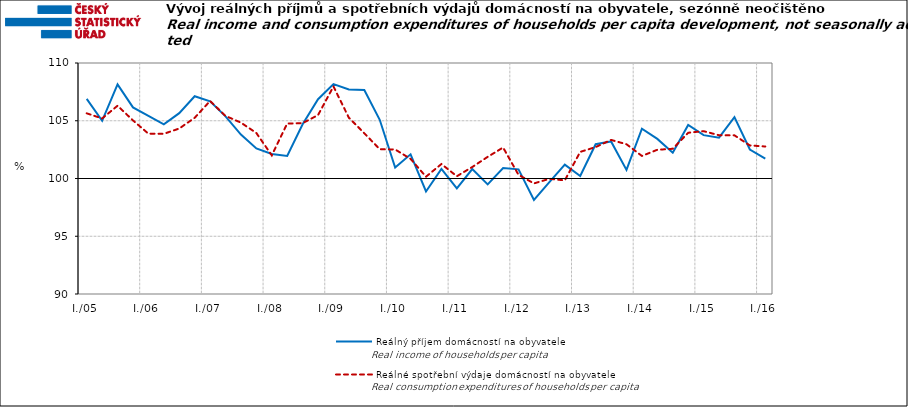
| Category | Reálný příjem domácností na obyvatele | Reálné spotřební výdaje domácností na obyvatele |
|---|---|---|
| I./05 | 106.898 | 105.642 |
|  | 104.998 | 105.199 |
|  | 108.15 | 106.3 |
|  | 106.155 | 105.031 |
| I./06 | 105.431 | 103.879 |
|  | 104.685 | 103.87 |
|  | 105.658 | 104.326 |
|  | 107.121 | 105.256 |
| I./07 | 106.684 | 106.711 |
|  | 105.383 | 105.42 |
|  | 103.807 | 104.837 |
|  | 102.598 | 103.939 |
| I./08 | 102.123 | 102.003 |
|  | 101.955 | 104.757 |
|  | 104.7 | 104.794 |
|  | 106.862 | 105.492 |
| I./09 | 108.173 | 107.97 |
|  | 107.713 | 105.261 |
|  | 107.657 | 103.919 |
|  | 105.084 | 102.535 |
| I./10 | 100.941 | 102.513 |
|  | 102.091 | 101.699 |
|  | 98.879 | 100.155 |
|  | 100.825 | 101.253 |
| I./11 | 99.141 | 100.195 |
|  | 100.817 | 100.995 |
|  | 99.488 | 101.876 |
|  | 100.901 | 102.682 |
| I./12 | 100.794 | 100.316 |
|  | 98.144 | 99.573 |
|  | 99.679 | 99.975 |
|  | 101.203 | 99.837 |
| I./13 | 100.22 | 102.304 |
|  | 102.967 | 102.721 |
|  | 103.21 | 103.342 |
|  | 100.746 | 102.966 |
| I./14 | 104.315 | 101.952 |
|  | 103.429 | 102.488 |
|  | 102.237 | 102.572 |
|  | 104.631 | 103.961 |
| I./15 | 103.755 | 104.1 |
|  | 103.538 | 103.744 |
|  | 105.317 | 103.739 |
|  | 102.506 | 102.864 |
| I./16 | 101.728 | 102.771 |